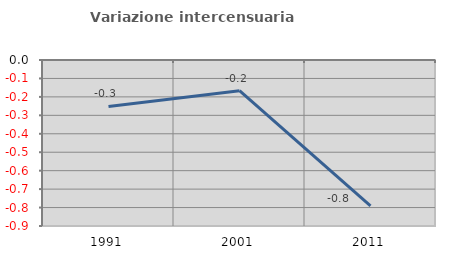
| Category | Variazione intercensuaria annua |
|---|---|
| 1991.0 | -0.252 |
| 2001.0 | -0.166 |
| 2011.0 | -0.791 |